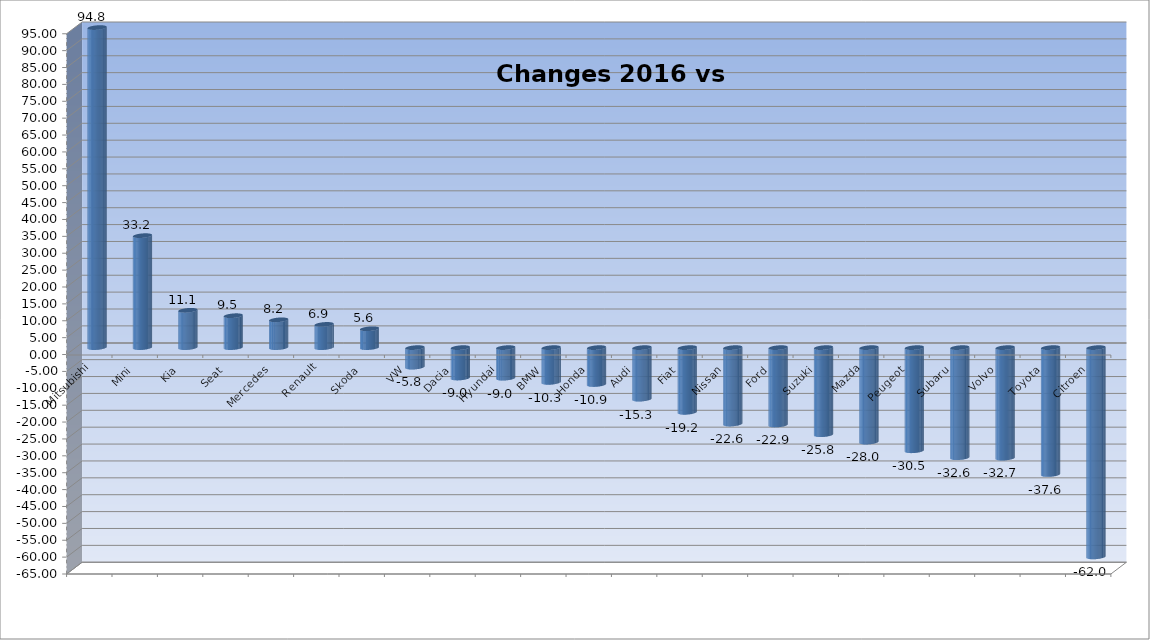
| Category | Ytd 2015 |
|---|---|
| Mitsubishi | 94.788 |
| Mini | 33.161 |
| Kia | 11.052 |
| Seat | 9.457 |
| Mercedes | 8.235 |
| Renault | 6.88 |
| Skoda | 5.585 |
| VW | -5.78 |
| Dacia | -9.006 |
| Hyundai | -9.05 |
| BMW | -10.291 |
| Honda | -10.931 |
| Audi | -15.265 |
| Fiat | -19.164 |
| Nissan | -22.632 |
| Ford | -22.923 |
| Suzuki | -25.789 |
| Mazda | -27.979 |
| Peugeot | -30.549 |
| Subaru | -32.597 |
| Volvo | -32.731 |
| Toyota | -37.576 |
| Citroen | -61.977 |